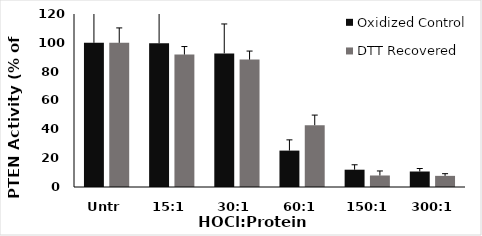
| Category | Oxidized Control | DTT Recovered |
|---|---|---|
| Untr | 100 | 100 |
| 15:1 | 99.659 | 91.868 |
| 30:1 | 92.678 | 88.353 |
| 60:1 | 25.248 | 42.879 |
| 150:1 | 11.997 | 7.984 |
| 300:1 | 10.743 | 7.726 |